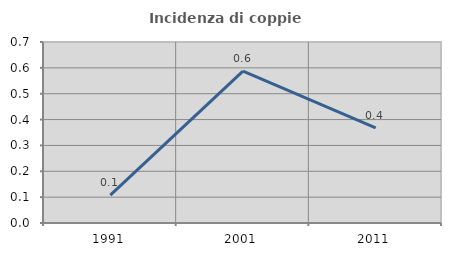
| Category | Incidenza di coppie miste |
|---|---|
| 1991.0 | 0.107 |
| 2001.0 | 0.588 |
| 2011.0 | 0.367 |